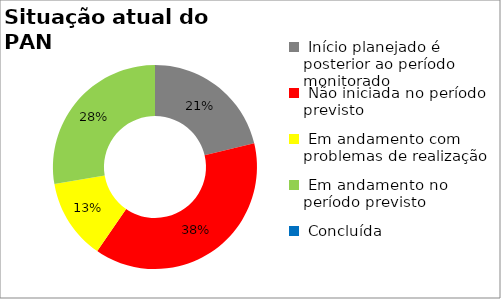
| Category | Series 0 |
|---|---|
|  Início planejado é posterior ao período monitorado | 0.213 |
|  Não iniciada no período previsto | 0.383 |
|  Em andamento com problemas de realização | 0.128 |
|  Em andamento no período previsto  | 0.277 |
|  Concluída | 0 |